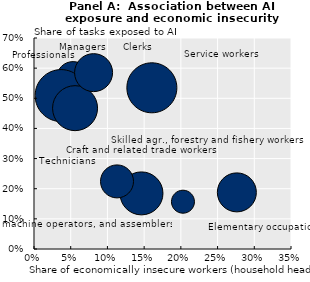
| Category | Risk of automation |
|---|---|
| 0.05309905111789703 | 0.567 |
| 0.03696223720908165 | 0.509 |
| 0.05547585338354111 | 0.468 |
| 0.08112284541130066 | 0.585 |
| 0.1598507463932037 | 0.536 |
| 0.2022567540407181 | 0.158 |
| 0.1458368599414825 | 0.186 |
| 0.1129690632224083 | 0.224 |
| 0.2758290469646454 | 0.189 |